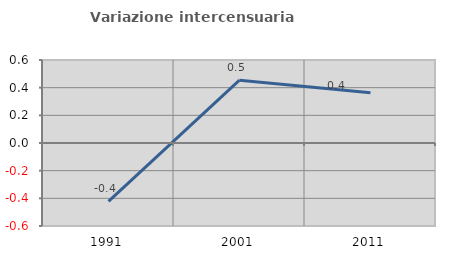
| Category | Variazione intercensuaria annua |
|---|---|
| 1991.0 | -0.421 |
| 2001.0 | 0.454 |
| 2011.0 | 0.364 |